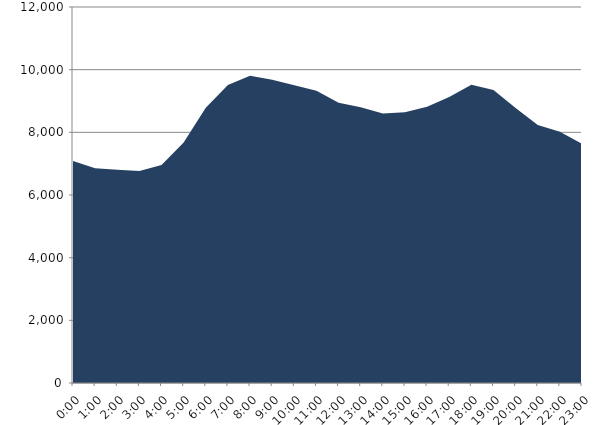
| Category | Series 0 | Series 1 |
|---|---|---|
| 2023-03-15 |  | 7083.448 |
| 2023-03-15 01:00:00 |  | 6854.558 |
| 2023-03-15 02:00:00 |  | 6804.989 |
| 2023-03-15 03:00:00 |  | 6762.131 |
| 2023-03-15 04:00:00 |  | 6953.481 |
| 2023-03-15 05:00:00 |  | 7671.747 |
| 2023-03-15 06:00:00 |  | 8784.794 |
| 2023-03-15 07:00:00 |  | 9508.023 |
| 2023-03-15 08:00:00 |  | 9805.139 |
| 2023-03-15 09:00:00 |  | 9677.46 |
| 2023-03-15 10:00:00 |  | 9506.269 |
| 2023-03-15 11:00:00 |  | 9325.392 |
| 2023-03-15 12:00:00 |  | 8943.698 |
| 2023-03-15 13:00:00 |  | 8798.574 |
| 2023-03-15 14:00:00 |  | 8598.899 |
| 2023-03-15 15:00:00 |  | 8638.27 |
| 2023-03-15 16:00:00 |  | 8813.159 |
| 2023-03-15 17:00:00 |  | 9123.997 |
| 2023-03-15 18:00:00 |  | 9518.076 |
| 2023-03-15 19:00:00 |  | 9353.345 |
| 2023-03-15 20:00:00 |  | 8773.551 |
| 2023-03-15 21:00:00 |  | 8237.294 |
| 2023-03-15 22:00:00 |  | 8022.126 |
| 2023-03-15 23:00:00 |  | 7633.658 |